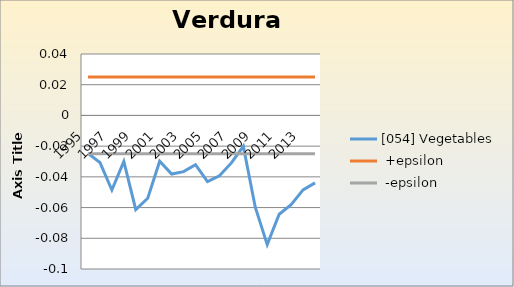
| Category | [054] Vegetables |  +epsilon |  -epsilon |
|---|---|---|---|
| 1995.0 | -0.025 | 0.025 | -0.025 |
| 1996.0 | -0.031 | 0.025 | -0.025 |
| 1997.0 | -0.049 | 0.025 | -0.025 |
| 1998.0 | -0.03 | 0.025 | -0.025 |
| 1999.0 | -0.061 | 0.025 | -0.025 |
| 2000.0 | -0.054 | 0.025 | -0.025 |
| 2001.0 | -0.03 | 0.025 | -0.025 |
| 2002.0 | -0.038 | 0.025 | -0.025 |
| 2003.0 | -0.037 | 0.025 | -0.025 |
| 2004.0 | -0.032 | 0.025 | -0.025 |
| 2005.0 | -0.043 | 0.025 | -0.025 |
| 2006.0 | -0.039 | 0.025 | -0.025 |
| 2007.0 | -0.031 | 0.025 | -0.025 |
| 2008.0 | -0.02 | 0.025 | -0.025 |
| 2009.0 | -0.06 | 0.025 | -0.025 |
| 2010.0 | -0.084 | 0.025 | -0.025 |
| 2011.0 | -0.064 | 0.025 | -0.025 |
| 2012.0 | -0.058 | 0.025 | -0.025 |
| 2013.0 | -0.049 | 0.025 | -0.025 |
| 2014.0 | -0.044 | 0.025 | -0.025 |